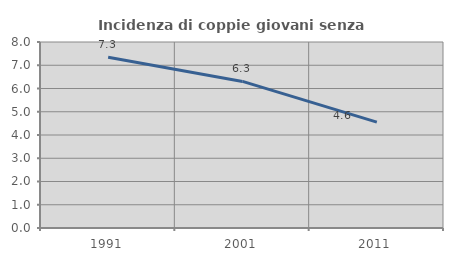
| Category | Incidenza di coppie giovani senza figli |
|---|---|
| 1991.0 | 7.344 |
| 2001.0 | 6.304 |
| 2011.0 | 4.554 |